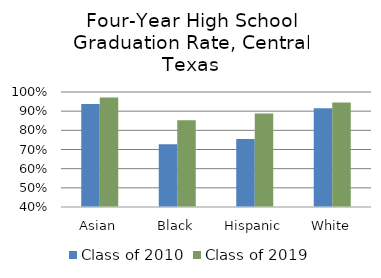
| Category | Class of 2010 | Class of 2019 |
|---|---|---|
| Asian | 0.937 | 0.971 |
| Black | 0.727 | 0.853 |
| Hispanic | 0.755 | 0.888 |
| White | 0.915 | 0.945 |